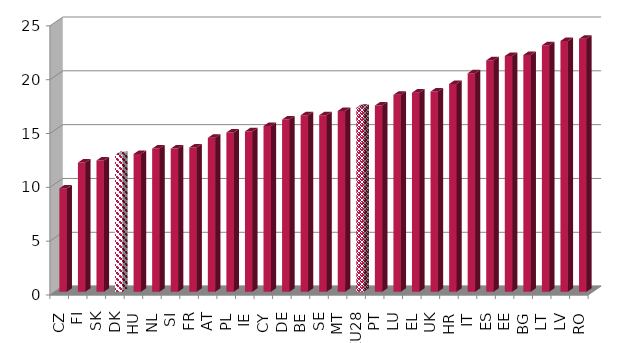
| Category | Series 0 |
|---|---|
| CZ | 9.6 |
| FI | 12 |
| SK | 12.2 |
| DK | 12.7 |
| HU | 12.8 |
| NL | 13.3 |
| SI | 13.3 |
| FR | 13.4 |
| AT | 14.3 |
| PL | 14.8 |
| IE | 14.9 |
| CY | 15.4 |
| DE | 16 |
| BE | 16.4 |
| SE | 16.4 |
| MT | 16.8 |
| EU28 | 17.1 |
| PT | 17.3 |
| LU | 18.3 |
| EL | 18.5 |
| UK | 18.6 |
| HR | 19.3 |
| IT | 20.3 |
| ES | 21.5 |
| EE | 21.9 |
| BG | 22 |
| LT | 22.9 |
| LV | 23.3 |
| RO | 23.5 |